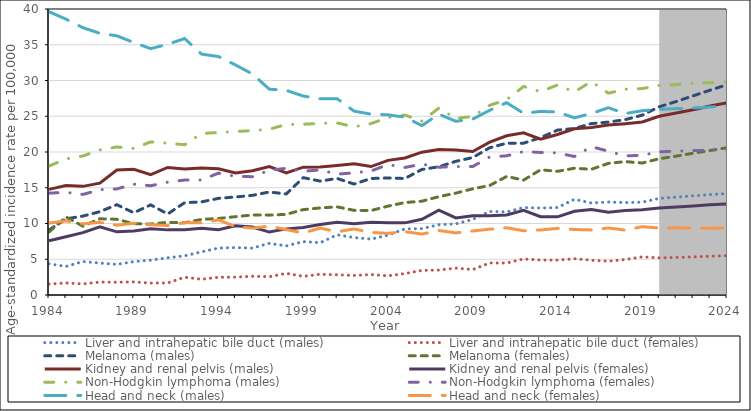
| Category | Liver and intrahepatic bile duct (males) | Liver and intrahepatic bile duct (females) | Melanoma (males) | Melanoma (females) | Kidney and renal pelvis (males) | Kidney and renal pelvis (females) | Non-Hodgkin lymphoma (males) | Non-Hodgkin lymphoma (females) | Head and neck (males) | Head and neck (females) |
|---|---|---|---|---|---|---|---|---|---|---|
| 1984.0 | 4.359 | 1.531 | 9.083 | 8.805 | 14.774 | 7.577 | 18.038 | 14.243 | 39.619 | 10.056 |
| 1985.0 | 3.998 | 1.686 | 10.654 | 10.918 | 15.314 | 8.153 | 19.029 | 14.363 | 38.587 | 10.369 |
| 1986.0 | 4.683 | 1.552 | 11.036 | 9.636 | 15.194 | 8.726 | 19.442 | 14.063 | 37.383 | 9.96 |
| 1987.0 | 4.463 | 1.805 | 11.651 | 10.658 | 15.635 | 9.542 | 20.285 | 14.733 | 36.596 | 10.151 |
| 1988.0 | 4.281 | 1.79 | 12.631 | 10.597 | 17.478 | 8.835 | 20.702 | 14.836 | 36.254 | 9.763 |
| 1989.0 | 4.665 | 1.832 | 11.504 | 9.966 | 17.589 | 8.937 | 20.5 | 15.503 | 35.301 | 10.032 |
| 1990.0 | 4.879 | 1.666 | 12.608 | 9.928 | 16.837 | 9.248 | 21.41 | 15.28 | 34.458 | 9.83 |
| 1991.0 | 5.205 | 1.688 | 11.33 | 10.164 | 17.841 | 9.109 | 21.228 | 15.775 | 35.062 | 9.717 |
| 1992.0 | 5.476 | 2.484 | 12.909 | 10.099 | 17.614 | 9.138 | 21.016 | 16.08 | 35.87 | 10.112 |
| 1993.0 | 6.032 | 2.202 | 13.025 | 10.577 | 17.753 | 9.343 | 22.591 | 16.085 | 33.689 | 10.097 |
| 1994.0 | 6.567 | 2.483 | 13.515 | 10.706 | 17.666 | 9.131 | 22.729 | 17.047 | 33.353 | 10.502 |
| 1995.0 | 6.628 | 2.5 | 13.709 | 10.955 | 17.055 | 9.685 | 22.865 | 16.594 | 32.178 | 9.554 |
| 1996.0 | 6.554 | 2.623 | 13.935 | 11.193 | 17.383 | 9.516 | 22.995 | 16.548 | 30.914 | 9.35 |
| 1997.0 | 7.23 | 2.56 | 14.405 | 11.17 | 17.95 | 8.801 | 23.179 | 17.444 | 28.785 | 9.637 |
| 1998.0 | 6.86 | 3.027 | 14.13 | 11.282 | 17.076 | 9.247 | 23.85 | 17.725 | 28.625 | 9.143 |
| 1999.0 | 7.466 | 2.611 | 16.415 | 11.941 | 17.879 | 9.443 | 23.879 | 17.31 | 27.829 | 8.669 |
| 2000.0 | 7.319 | 2.899 | 15.931 | 12.177 | 17.892 | 9.872 | 24.006 | 17.486 | 27.435 | 9.367 |
| 2001.0 | 8.415 | 2.827 | 16.305 | 12.324 | 18.123 | 10.175 | 24.063 | 16.896 | 27.459 | 8.839 |
| 2002.0 | 8.031 | 2.736 | 15.517 | 11.84 | 18.363 | 9.959 | 23.525 | 17.091 | 25.713 | 9.232 |
| 2003.0 | 7.818 | 2.863 | 16.295 | 11.815 | 17.963 | 10.169 | 23.981 | 17.346 | 25.297 | 8.754 |
| 2004.0 | 8.375 | 2.678 | 16.367 | 12.431 | 18.832 | 10.114 | 24.828 | 18.244 | 25.195 | 8.623 |
| 2005.0 | 9.246 | 3.005 | 16.295 | 12.932 | 19.167 | 10.092 | 25.157 | 17.843 | 24.872 | 8.862 |
| 2006.0 | 9.285 | 3.436 | 17.558 | 13.119 | 19.973 | 10.597 | 24.324 | 18.3 | 23.694 | 8.523 |
| 2007.0 | 9.83 | 3.49 | 17.933 | 13.757 | 20.347 | 11.874 | 26.143 | 17.869 | 25.285 | 9.026 |
| 2008.0 | 9.939 | 3.755 | 18.696 | 14.245 | 20.291 | 10.785 | 24.704 | 17.957 | 24.3 | 8.683 |
| 2009.0 | 10.58 | 3.563 | 19.225 | 14.854 | 20.077 | 11.082 | 24.969 | 17.97 | 24.605 | 8.951 |
| 2010.0 | 11.686 | 4.48 | 20.597 | 15.318 | 21.388 | 11.099 | 26.524 | 19.307 | 25.832 | 9.206 |
| 2011.0 | 11.62 | 4.473 | 21.231 | 16.577 | 22.263 | 11.183 | 27.319 | 19.47 | 26.901 | 9.402 |
| 2012.0 | 12.23 | 5.045 | 21.23 | 16.072 | 22.685 | 11.838 | 29.165 | 20.061 | 25.412 | 8.985 |
| 2013.0 | 12.156 | 4.885 | 22.016 | 17.515 | 21.798 | 10.96 | 28.437 | 19.936 | 25.675 | 9.094 |
| 2014.0 | 12.239 | 4.879 | 23.061 | 17.294 | 22.454 | 10.935 | 29.375 | 19.867 | 25.591 | 9.316 |
| 2015.0 | 13.381 | 5.077 | 23.293 | 17.732 | 23.249 | 11.717 | 28.399 | 19.367 | 24.78 | 9.162 |
| 2016.0 | 12.862 | 4.858 | 23.974 | 17.582 | 23.434 | 11.971 | 29.862 | 20.75 | 25.386 | 9.099 |
| 2017.0 | 13.004 | 4.733 | 24.183 | 18.407 | 23.769 | 11.581 | 28.225 | 20.113 | 26.189 | 9.373 |
| 2018.0 | 12.93 | 4.957 | 24.526 | 18.659 | 23.963 | 11.821 | 28.787 | 19.446 | 25.381 | 9.07 |
| 2019.0 | 12.988 | 5.336 | 25.152 | 18.458 | 24.201 | 11.931 | 28.871 | 19.551 | 25.775 | 9.552 |
| 2020.0 | 13.509 | 5.196 | 26.321 | 19.057 | 24.993 | 12.156 | 29.32 | 20.025 | 25.958 | 9.371 |
| 2021.0 | 13.683 | 5.251 | 27.055 | 19.423 | 25.448 | 12.3 | 29.422 | 20.106 | 26.069 | 9.391 |
| 2022.0 | 13.867 | 5.328 | 27.856 | 19.826 | 25.919 | 12.447 | 29.596 | 20.198 | 26.17 | 9.365 |
| 2023.0 | 14.047 | 5.422 | 28.646 | 20.209 | 26.425 | 12.615 | 29.693 | 20.26 | 26.291 | 9.338 |
| 2024.0 | 14.186 | 5.501 | 29.406 | 20.593 | 26.884 | 12.738 | 29.811 | 20.318 | 26.406 | 9.366 |